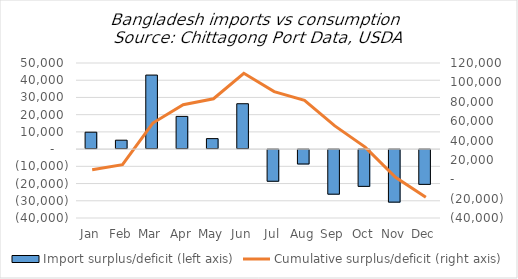
| Category | Import surplus/deficit (left axis) |
|---|---|
| Jan | 9825 |
| Feb | 5175 |
| Mar | 42994 |
| Apr | 18993 |
| May | 6092 |
| Jun | 26355 |
| Jul | -18957 |
| Aug | -8927 |
| Sep | -26462 |
| Oct | -21920 |
| Nov | -31076 |
| Dec | -20763 |